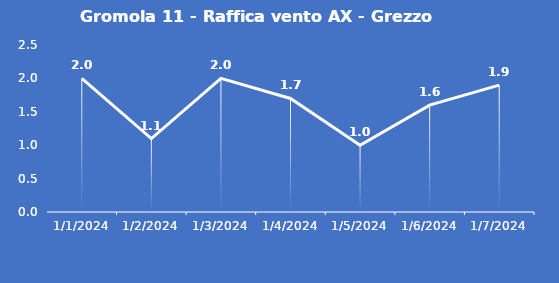
| Category | Gromola 11 - Raffica vento AX - Grezzo (m/s) |
|---|---|
| 1/1/24 | 2 |
| 1/2/24 | 1.1 |
| 1/3/24 | 2 |
| 1/4/24 | 1.7 |
| 1/5/24 | 1 |
| 1/6/24 | 1.6 |
| 1/7/24 | 1.9 |